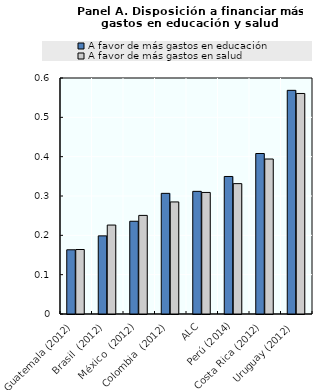
| Category | A favor de más gastos en educación | A favor de más gastos en salud |
|---|---|---|
| Guatemala (2012) | 0.163 | 0.164 |
| Brasil  (2012) | 0.199 | 0.226 |
| México  (2012) | 0.236 | 0.251 |
| Colombia  (2012) | 0.307 | 0.285 |
| ALC | 0.312 | 0.309 |
| Perú (2014) | 0.35 | 0.331 |
| Costa Rica (2012) | 0.408 | 0.394 |
| Uruguay (2012) | 0.569 | 0.561 |